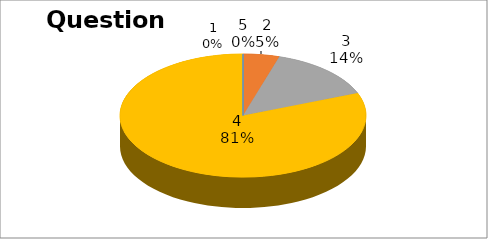
| Category | Series 0 |
|---|---|
| 0 | 0 |
| 1 | 1 |
| 2 | 3 |
| 3 | 17 |
| 4 | 0 |